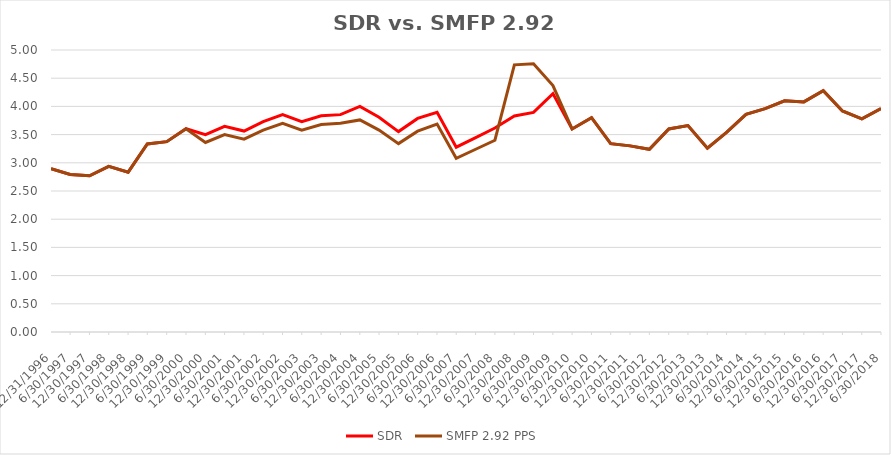
| Category | SDR | SMFP 2.92 PPS |
|---|---|---|
| 12/31/96 | 2.896 | 2.896 |
| 6/30/97 | 2.792 | 2.792 |
| 12/31/97 | 2.771 | 2.771 |
| 6/30/98 | 2.938 | 2.938 |
| 12/31/98 | 2.833 | 2.833 |
| 6/30/99 | 3.333 | 3.333 |
| 12/31/99 | 3.375 | 3.375 |
| 6/30/00 | 3.604 | 3.604 |
| 12/31/00 | 3.5 | 3.36 |
| 6/30/01 | 3.646 | 3.5 |
| 12/31/01 | 3.562 | 3.42 |
| 6/30/02 | 3.729 | 3.58 |
| 12/31/02 | 3.854 | 3.7 |
| 6/30/03 | 3.729 | 3.58 |
| 12/31/03 | 3.833 | 3.68 |
| 6/30/04 | 3.854 | 3.7 |
| 12/31/04 | 4 | 3.76 |
| 6/30/05 | 3.809 | 3.58 |
| 12/31/05 | 3.553 | 3.34 |
| 6/30/06 | 3.787 | 3.56 |
| 12/31/06 | 3.894 | 3.687 |
| 6/30/07 | 3.277 | 3.08 |
| 12/31/07 | 3.447 | 3.24 |
| 6/30/08 | 3.617 | 3.4 |
| 12/31/08 | 3.83 | 4.737 |
| 6/30/09 | 3.894 | 4.754 |
| 12/31/09 | 4.227 | 4.369 |
| 6/30/10 | 3.6 | 3.6 |
| 12/31/10 | 3.8 | 3.8 |
| 6/30/11 | 3.34 | 3.34 |
| 12/31/11 | 3.3 | 3.3 |
| 6/30/12 | 3.24 | 3.24 |
| 12/31/12 | 3.6 | 3.6 |
| 6/30/13 | 3.66 | 3.66 |
| 12/31/13 | 3.26 | 3.26 |
| 6/30/14 | 3.54 | 3.54 |
| 12/31/14 | 3.86 | 3.86 |
| 6/30/15 | 3.96 | 3.96 |
| 12/31/15 | 4.1 | 4.1 |
| 6/30/16 | 4.08 | 4.08 |
| 12/31/16 | 4.28 | 4.28 |
| 6/30/17 | 3.92 | 3.92 |
| 12/31/17 | 3.78 | 3.78 |
| 6/30/18 | 3.96 | 3.96 |